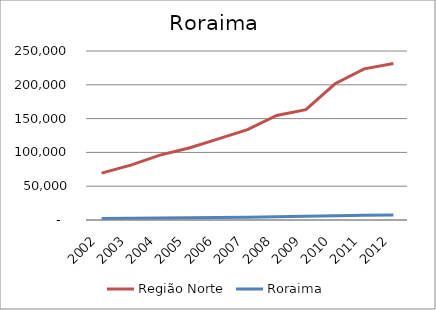
| Category | Região Norte | Roraima |
|---|---|---|
| 2002.0 | 69309.957 | 2312.646 |
| 2003.0 | 81199.581 | 2737.003 |
| 2004.0 | 96012.341 | 2811.079 |
| 2005.0 | 106441.71 | 3179.287 |
| 2006.0 | 119993.429 | 3660.083 |
| 2007.0 | 133578.391 | 4168.599 |
| 2008.0 | 154703.433 | 4889.301 |
| 2009.0 | 163207.956 | 5593.491 |
| 2010.0 | 201510.748 | 6340.601 |
| 2011.0 | 223537.9 | 6951.19 |
| 2012.0 | 231383.089 | 7313.836 |